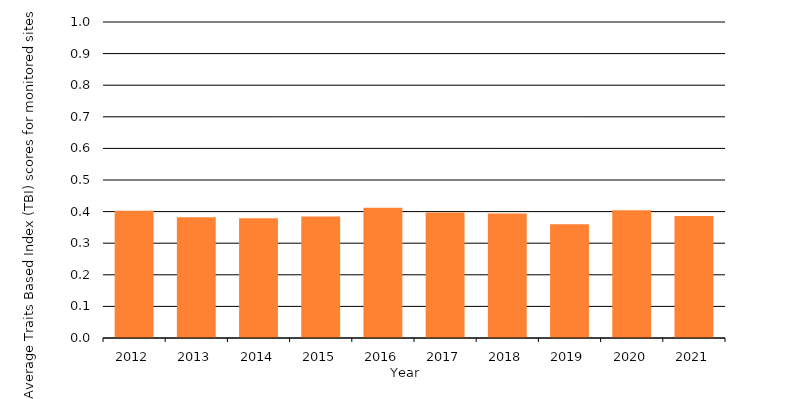
| Category | Regional index (average of all sites) |
|---|---|
| 2012.0 | 0.403 |
| 2013.0 | 0.382 |
| 2014.0 | 0.379 |
| 2015.0 | 0.384 |
| 2016.0 | 0.412 |
| 2017.0 | 0.397 |
| 2018.0 | 0.394 |
| 2019.0 | 0.36 |
| 2020.0 | 0.404 |
| 2021.0 | 0.386 |